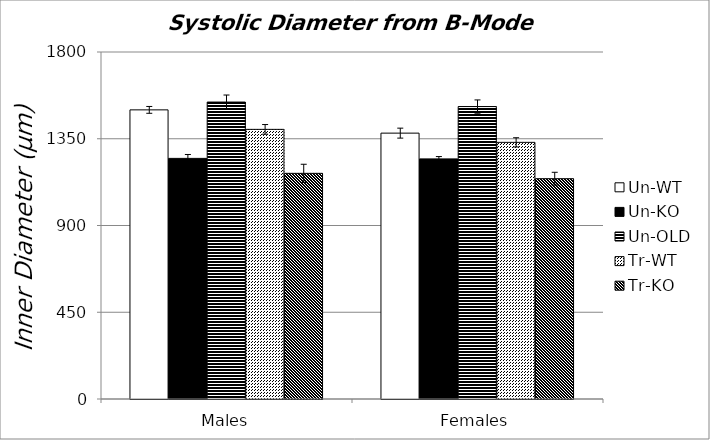
| Category | Un-WT | Un-KO | Un-OLD | Tr-WT | Tr-KO |
|---|---|---|---|---|---|
| 0 | 1499.794 | 1248.167 | 1540.342 | 1398.7 | 1170.583 |
| 1 | 1379.132 | 1245.548 | 1516.997 | 1331.284 | 1142.859 |